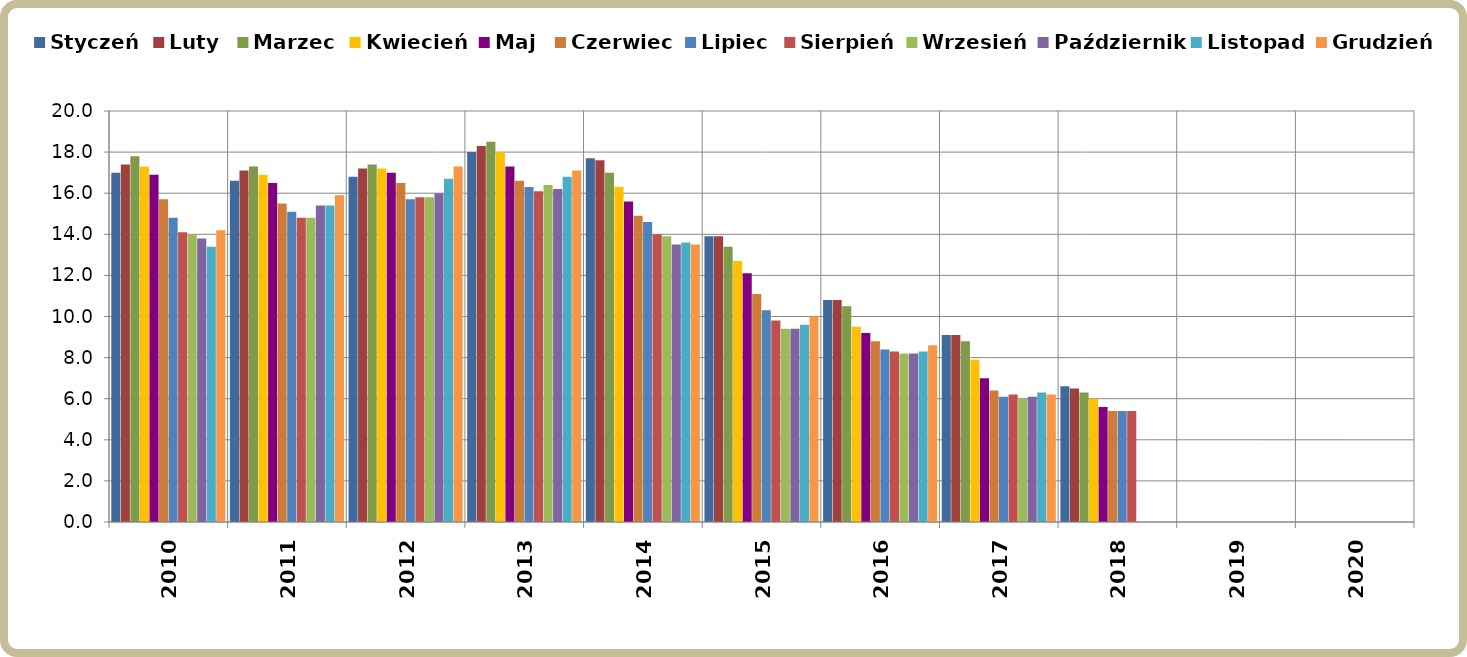
| Category | Styczeń | Luty | Marzec | Kwiecień | Maj | Czerwiec | Lipiec | Sierpień | Wrzesień | Październik | Listopad | Grudzień |
|---|---|---|---|---|---|---|---|---|---|---|---|---|
| 2010.0 | 17 | 17.4 | 17.8 | 17.3 | 16.9 | 15.7 | 14.8 | 14.1 | 14 | 13.8 | 13.4 | 14.2 |
| 2011.0 | 16.6 | 17.1 | 17.3 | 16.9 | 16.5 | 15.5 | 15.1 | 14.8 | 14.8 | 15.4 | 15.4 | 15.9 |
| 2012.0 | 16.8 | 17.2 | 17.4 | 17.2 | 17 | 16.5 | 15.7 | 15.8 | 15.8 | 16 | 16.7 | 17.3 |
| 2013.0 | 18 | 18.3 | 18.5 | 18 | 17.3 | 16.6 | 16.3 | 16.1 | 16.4 | 16.2 | 16.8 | 17.1 |
| 2014.0 | 17.7 | 17.6 | 17 | 16.3 | 15.6 | 14.9 | 14.6 | 14 | 13.9 | 13.5 | 13.6 | 13.5 |
| 2015.0 | 13.9 | 13.9 | 13.4 | 12.7 | 12.1 | 11.1 | 10.3 | 9.8 | 9.4 | 9.4 | 9.6 | 10 |
| 2016.0 | 10.8 | 10.8 | 10.5 | 9.5 | 9.2 | 8.8 | 8.4 | 8.3 | 8.2 | 8.2 | 8.3 | 8.6 |
| 2017.0 | 9.1 | 9.1 | 8.8 | 7.9 | 7 | 6.4 | 6.1 | 6.2 | 6 | 6.1 | 6.3 | 6.2 |
| 2018.0 | 6.6 | 6.5 | 6.3 | 6 | 5.6 | 5.4 | 5.4 | 5.4 | 0 | 0 | 0 | 0 |
| 2019.0 | 0 | 0 | 0 | 0 | 0 | 0 | 0 | 0 | 0 | 0 | 0 | 0 |
| 2020.0 | 0 | 0 | 0 | 0 | 0 | 0 | 0 | 0 | 0 | 0 | 0 | 0 |